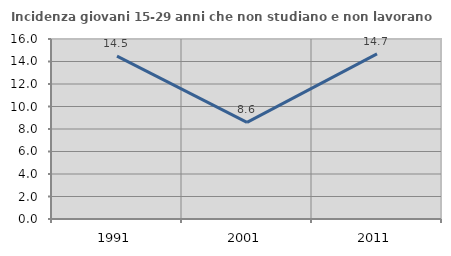
| Category | Incidenza giovani 15-29 anni che non studiano e non lavorano  |
|---|---|
| 1991.0 | 14.479 |
| 2001.0 | 8.594 |
| 2011.0 | 14.671 |